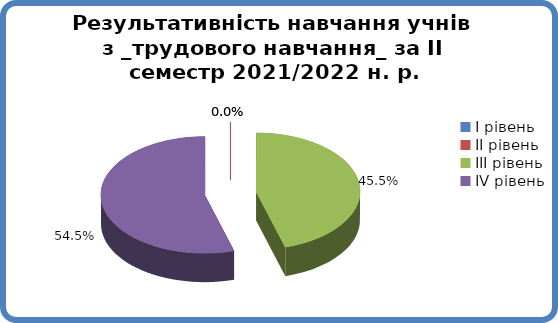
| Category | Series 0 |
|---|---|
| 0 | 0 |
| 1 | 0 |
| 2 | 0.455 |
| 3 | 0.545 |